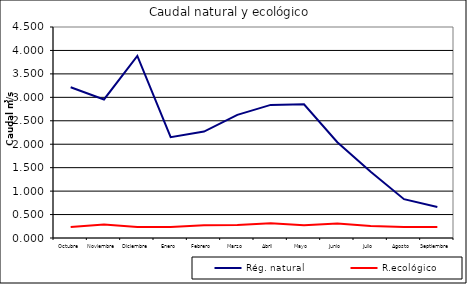
| Category | Rég. natural | R.ecológico |
|---|---|---|
| Octubre | 3.216 | 0.232 |
| Noviembre | 2.955 | 0.289 |
| Diciembre | 3.882 | 0.232 |
| Enero | 2.15 | 0.232 |
| Febrero | 2.27 | 0.271 |
| Marzo | 2.627 | 0.279 |
| Abril | 2.839 | 0.317 |
| Mayo | 2.851 | 0.271 |
| Junio | 2.042 | 0.307 |
| Julio | 1.411 | 0.256 |
| Agosto | 0.828 | 0.232 |
| Septiembre | 0.663 | 0.232 |